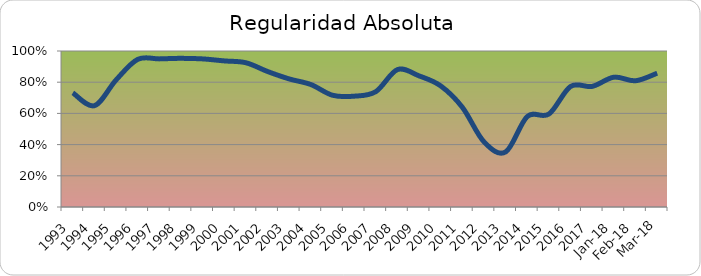
| Category | Series 0 |
|---|---|
| 1993.0 | 0.732 |
| 1994.0 | 0.65 |
| 1995.0 | 0.815 |
| 1996.0 | 0.947 |
| 1997.0 | 0.949 |
| 1998.0 | 0.953 |
| 1999.0 | 0.949 |
| 2000.0 | 0.936 |
| 2001.0 | 0.925 |
| 2002.0 | 0.868 |
| 2003.0 | 0.821 |
| 2004.0 | 0.785 |
| 2005.0 | 0.716 |
| 2006.0 | 0.71 |
| 2007.0 | 0.74 |
| 2008.0 | 0.881 |
| 2009.0 | 0.84 |
| 2010.0 | 0.776 |
| 2011.0 | 0.639 |
| 2012.0 | 0.417 |
| 2013.0 | 0.353 |
| 2014.0 | 0.58 |
| 2015.0 | 0.596 |
| 2016.0 | 0.773 |
| 2017.0 | 0.773 |
| 43101.0 | 0.832 |
| 43132.0 | 0.809 |
| 43160.0 | 0.858 |